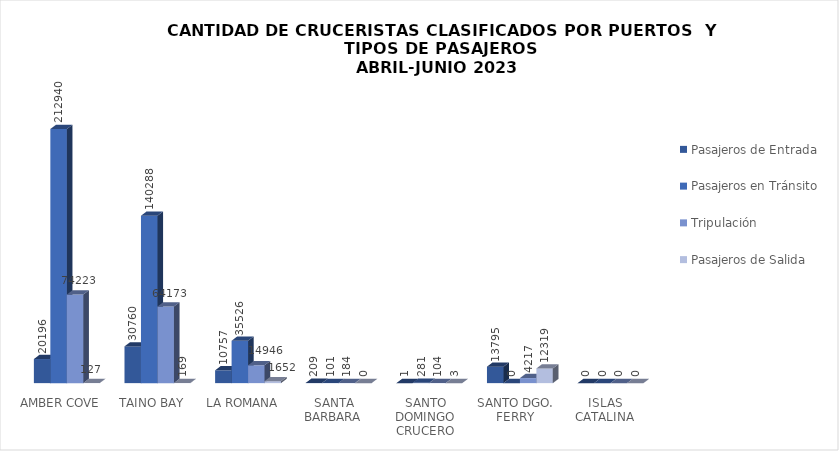
| Category | Pasajeros de Entrada | Pasajeros en Tránsito | Tripulación | Pasajeros de Salida |
|---|---|---|---|---|
| AMBER COVE | 20196 | 212940 | 74223 | 127 |
| TAINO BAY | 30760 | 140288 | 64173 | 169 |
| LA ROMANA | 10757 | 35526 | 14946 | 1652 |
| SANTA BARBARA  | 209 | 101 | 184 | 0 |
| SANTO DOMINGO CRUCERO | 1 | 281 | 104 | 3 |
| SANTO DGO. FERRY | 13795 | 0 | 4217 | 12319 |
| ISLAS  CATALINA  | 0 | 0 | 0 | 0 |